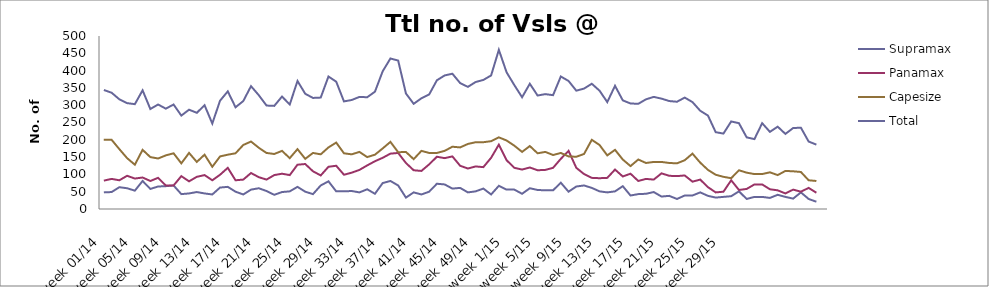
| Category | Supramax | Panamax | Capesize | Total |
|---|---|---|---|---|
| week 01/14 | 48 | 82 | 200 | 344 |
| week 02/14 | 49 | 87 | 200 | 336 |
| week 03/14 | 63 | 83 | 173 | 317 |
| week 04/14 | 60 | 96 | 147 | 306 |
| week 05/14 | 53 | 88 | 128 | 303 |
| week 06/14 | 81 | 91 | 171 | 343 |
| week 07/14 | 58 | 81 | 150 | 289 |
| week 08/14 | 65 | 90 | 146 | 302 |
| week 09/14 | 66 | 68 | 155 | 290 |
| week 10/14 | 68 | 68 | 161 | 302 |
| week 11/14 | 43 | 95 | 132 | 270 |
| week 12/14 | 45 | 80 | 162 | 287 |
| week 13/14 | 49 | 93 | 136 | 278 |
| week 14/14 | 45 | 98 | 157 | 300 |
| week 15/14 | 42 | 83 | 122 | 247 |
| week 16/14 | 62 | 99 | 152 | 313 |
| week 17/14 | 64 | 119 | 157 | 340 |
| week 18/14 | 50 | 83 | 161 | 294 |
| week 19/14 | 42 | 85 | 185 | 312 |
| week 20/14 | 56 | 104 | 195 | 355 |
| week 21/14 | 60 | 92 | 177 | 329 |
| week 22/14 | 52 | 85 | 162 | 299 |
| week 23/14 | 41 | 98 | 159 | 298 |
| week 24/14 | 49 | 102 | 168 | 325 |
| week 25/14 | 51 | 98 | 147 | 302 |
| week 26/14 | 64 | 128 | 173 | 370 |
| week 27/14 | 50 | 130 | 145 | 333 |
| week 28/14 | 43 | 109 | 162 | 321 |
| week 29/14 | 68 | 97 | 158 | 322 |
| week 30/14 | 80 | 122 | 178 | 383 |
| week 31/14 | 51 | 125 | 192 | 368 |
| week 32/14 | 51 | 99 | 161 | 311 |
| week 33/14 | 52 | 105 | 158 | 315 |
| week 34/14 | 48 | 113 | 165 | 324 |
| week 35/14 | 57 | 126 | 150 | 323 |
| week 36/14 | 44 | 138 | 157 | 339 |
| week 37/14 | 75 | 148 | 175 | 398 |
| week 38/14 | 81 | 160 | 194 | 435 |
| week 39/14 | 68 | 162 | 164 | 429 |
| week 40/14 | 33 | 133 | 165 | 334 |
| week 41/14 | 48 | 112 | 144 | 304 |
| week 42/14 | 42 | 110 | 168 | 320 |
| week 43/14 | 50 | 129 | 162 | 331 |
| week 44/14 | 73 | 151 | 162 | 372 |
| week 45/14 | 71 | 147 | 168 | 386 |
| week 46/14 | 59 | 152 | 180 | 391 |
| week 47/14 | 61 | 125 | 178 | 364 |
| week 48/14 | 48 | 117 | 188 | 353 |
| week 49/14 | 51 | 123 | 193 | 367 |
| week 50/14 | 59 | 121 | 193 | 373 |
| week 51/14 | 42 | 148 | 196 | 386 |
| week 52/14 | 67 | 186 | 207 | 460 |
| week 1/15 | 56 | 141 | 198 | 395 |
| week 2/15 | 56 | 119 | 183 | 358 |
| week 3/15 | 44 | 114 | 165 | 323 |
| week 4/15 | 60 | 120 | 182 | 362 |
| week 5/15 | 55 | 112 | 161 | 328 |
| week 6/15 | 54 | 113 | 165 | 332 |
| week 7/15 | 54 | 119 | 156 | 329 |
| week 8/15 | 76 | 145 | 162 | 383 |
| week 9/15 | 50 | 168 | 152 | 370 |
| week 10/15 | 65 | 119 | 151 | 342 |
| week 11/15 | 68 | 101 | 159 | 348 |
| week 12/15 | 61 | 90 | 200 | 362 |
| week 13/15 | 51 | 89 | 185 | 342 |
| week 14/15 | 48 | 90 | 155 | 309 |
| week 15/15 | 51 | 114 | 171 | 356 |
| week 16/15 | 66 | 94 | 143 | 314 |
| week 17/15 | 39 | 102 | 124 | 305 |
| week 18/15 | 43 | 81 | 143 | 304 |
| week 19/15 | 44 | 87 | 133 | 317 |
| week 20/15 | 49 | 85 | 136 | 324 |
| week 21/15 | 36 | 103 | 136 | 319 |
| week 22/15 | 38 | 96 | 133 | 312 |
| week 23/15 | 29 | 95 | 132 | 310 |
| week 24/15 | 39 | 97 | 141 | 322 |
| week 25/15 | 39 | 79 | 160 | 309 |
| week 26/15 | 48 | 85 | 134 | 284 |
| week 27/15 | 38 | 63 | 113 | 270 |
| week 28/15 | 33 | 48 | 99 | 222 |
| week 29/15 | 35 | 50 | 93 | 218 |
| week 30/15 | 37 | 83 | 89 | 253 |
| week 31/15 | 51 | 55 | 112 | 248 |